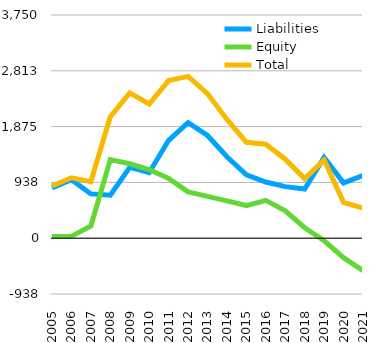
| Category | Liabilities  | Equity  | Total |
|---|---|---|---|
| 2005 | 846 | 30 | 876 |
| 2006 | 984 | 31 | 1015 |
| 2007 | 743.909 | 205.545 | 949.455 |
| 2008 | 721.818 | 1319.455 | 2041.273 |
| 2009 | 1190.364 | 1250.455 | 2440.818 |
| 2010 | 1100.364 | 1154.455 | 2254.818 |
| 2011 | 1644.364 | 1004.455 | 2648.818 |
| 2012 | 1940.364 | 778.455 | 2718.818 |
| 2013 | 1726.364 | 702.455 | 2428.818 |
| 2014 | 1368.364 | 626.455 | 1994.818 |
| 2015 | 1063.364 | 548.455 | 1611.818 |
| 2016 | 944.364 | 635.455 | 1579.818 |
| 2017 | 866.364 | 460.455 | 1326.818 |
| 2018 | 825.364 | 175.455 | 1000.818 |
| 2019 | 1358.364 | -43.545 | 1314.818 |
| 2020 | 929.364 | -327.545 | 601.818 |
| 2021 | 1053.064 | -547.045 | 506.018 |